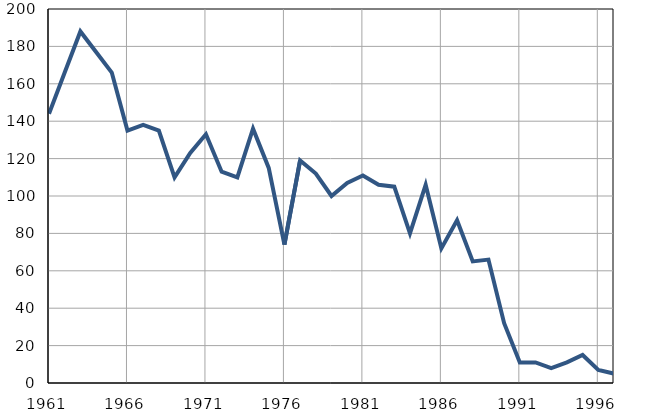
| Category | Умрла 
одојчад |
|---|---|
| 1961.0 | 144 |
| 1962.0 | 166 |
| 1963.0 | 188 |
| 1964.0 | 177 |
| 1965.0 | 166 |
| 1966.0 | 135 |
| 1967.0 | 138 |
| 1968.0 | 135 |
| 1969.0 | 110 |
| 1970.0 | 123 |
| 1971.0 | 133 |
| 1972.0 | 113 |
| 1973.0 | 110 |
| 1974.0 | 136 |
| 1975.0 | 115 |
| 1976.0 | 74 |
| 1977.0 | 119 |
| 1978.0 | 112 |
| 1979.0 | 100 |
| 1980.0 | 107 |
| 1981.0 | 111 |
| 1982.0 | 106 |
| 1983.0 | 105 |
| 1984.0 | 80 |
| 1985.0 | 106 |
| 1986.0 | 72 |
| 1987.0 | 87 |
| 1988.0 | 65 |
| 1989.0 | 66 |
| 1990.0 | 32 |
| 1991.0 | 11 |
| 1992.0 | 11 |
| 1993.0 | 8 |
| 1994.0 | 11 |
| 1995.0 | 15 |
| 1996.0 | 7 |
| 1997.0 | 5 |